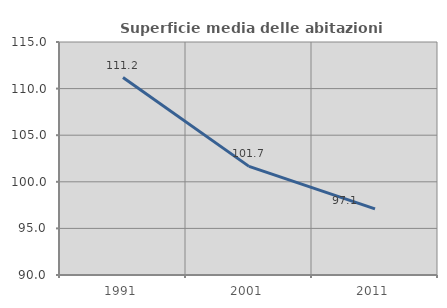
| Category | Superficie media delle abitazioni occupate |
|---|---|
| 1991.0 | 111.191 |
| 2001.0 | 101.652 |
| 2011.0 | 97.092 |